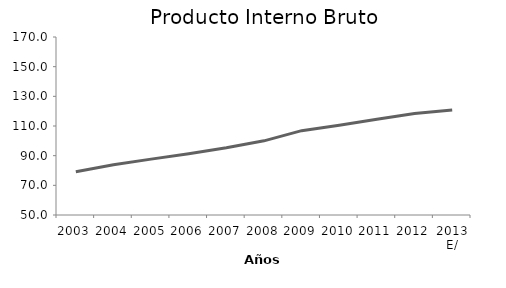
| Category | Producto Interno Bruto a precios de mercado  |
|---|---|
| 2003 | 79.209 |
| 2004 | 83.912 |
| 2005 | 87.677 |
| 2006 | 91.314 |
| 2007 | 95.322 |
| 2008 | 100 |
| 2009 | 106.856 |
| 2010 | 110.479 |
| 2011 | 114.597 |
| 2012 | 118.487 |
| 2013 E/ | 120.724 |